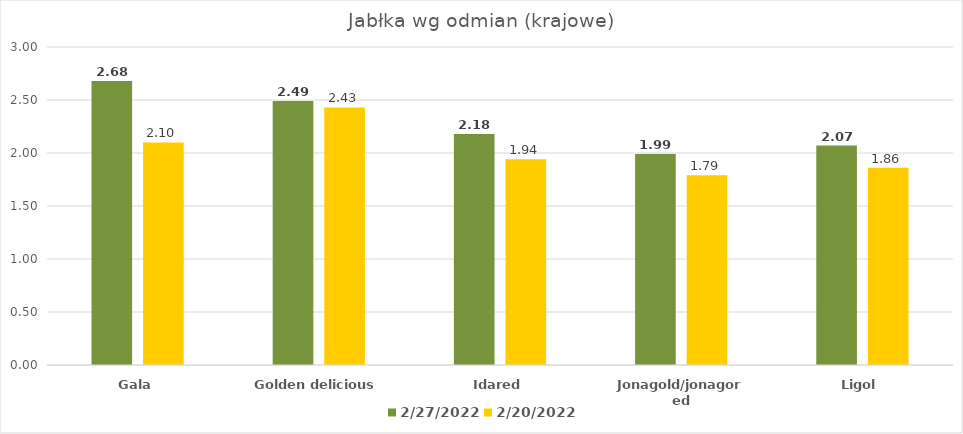
| Category | 2022-02-27 | 2022-02-20 |
|---|---|---|
| Gala | 2.68 | 2.1 |
| Golden delicious | 2.49 | 2.43 |
| Idared | 2.18 | 1.94 |
| Jonagold/jonagored | 1.99 | 1.79 |
| Ligol | 2.07 | 1.86 |